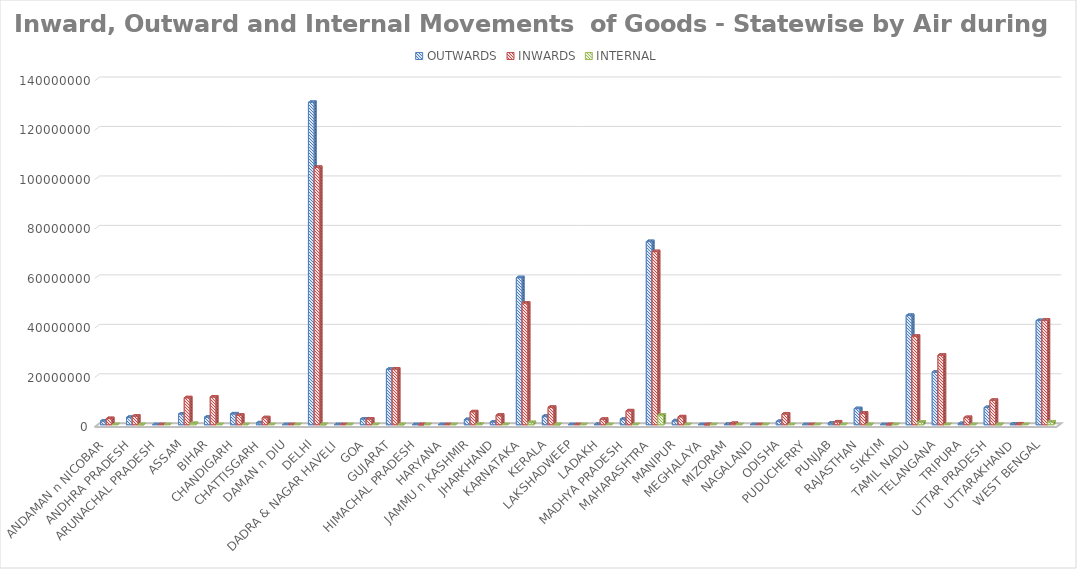
| Category | OUTWARDS | INWARDS | INTERNAL |
|---|---|---|---|
| ANDAMAN n NICOBAR | 1514603.46 | 2488958.79 | 0 |
| ANDHRA PRADESH | 2976601.67 | 3480053.63 | 10656.16 |
| ARUNACHAL PRADESH | 0 | 0 | 0 |
| ASSAM | 4328800.89 | 10900538.31 | 512366.65 |
| BIHAR | 3062477.86 | 11224029.62 | 0 |
| CHANDIGARH | 4380751.42 | 3888860.23 | 0 |
| CHATTISGARH | 762899.32 | 2823434.06 | 0 |
| DAMAN n DIU | 0 | 0 | 0 |
| DELHI | 130332249.3 | 104059233.163 | 1103.7 |
| DADRA & NAGAR HAVELI | 0 | 0 | 0 |
| GOA | 2295691.54 | 2309199.2 | 0 |
| GUJARAT | 22396247.403 | 22533877.17 | 15877.02 |
| HIMACHAL PRADESH | 0 | 242.8 | 0 |
| HARYANA | 0 | 0 | 0 |
| JAMMU n KASHMIR | 2084713.73 | 5215421.25 | 286830.51 |
| JHARKHAND | 1092332.94 | 3850224.9 | 0 |
| KARNATAKA | 59454988.48 | 49216049.457 | 863324.58 |
| KERALA | 3456419.26 | 7050212.04 | 1393.04 |
| LAKSHADWEEP | 0 | 0 | 0 |
| LADAKH | 103262.15 | 2203220.77 | 0 |
| MADHYA PRADESH | 2247490.7 | 5616334.04 | 0 |
| MAHARASHTRA | 74054947.077 | 69990082.43 | 3895042.12 |
| MANIPUR | 1577532.79 | 3197191.18 | 0 |
| MEGHALAYA | 0 | 161 | 0 |
| MIZORAM | 107278.76 | 524367.97 | 0 |
| NAGALAND | 0 | 0 | 0 |
| ODISHA | 1343308.44 | 4357564.24 | 0 |
| PUDUCHERRY | 0 | 0 | 0 |
| PUNJAB | 664627.51 | 1132028.26 | 0 |
| RAJASTHAN | 6505597.36 | 4677449.41 | 113 |
| SIKKIM | 0 | 25 | 0 |
| TAMIL NADU | 44198041.59 | 35777369.35 | 1056730.09 |
| TELANGANA | 21268772.02 | 28116633.01 | 0 |
| TRIPURA | 473701.66 | 2910296.12 | 0 |
| UTTAR PRADESH | 6978953.26 | 9858826.28 | 19544.85 |
| UTTARAKHAND | 204163.97 | 321967.07 | 0 |
| WEST BENGAL | 42118716.66 | 42261320.47 | 1128836.89 |